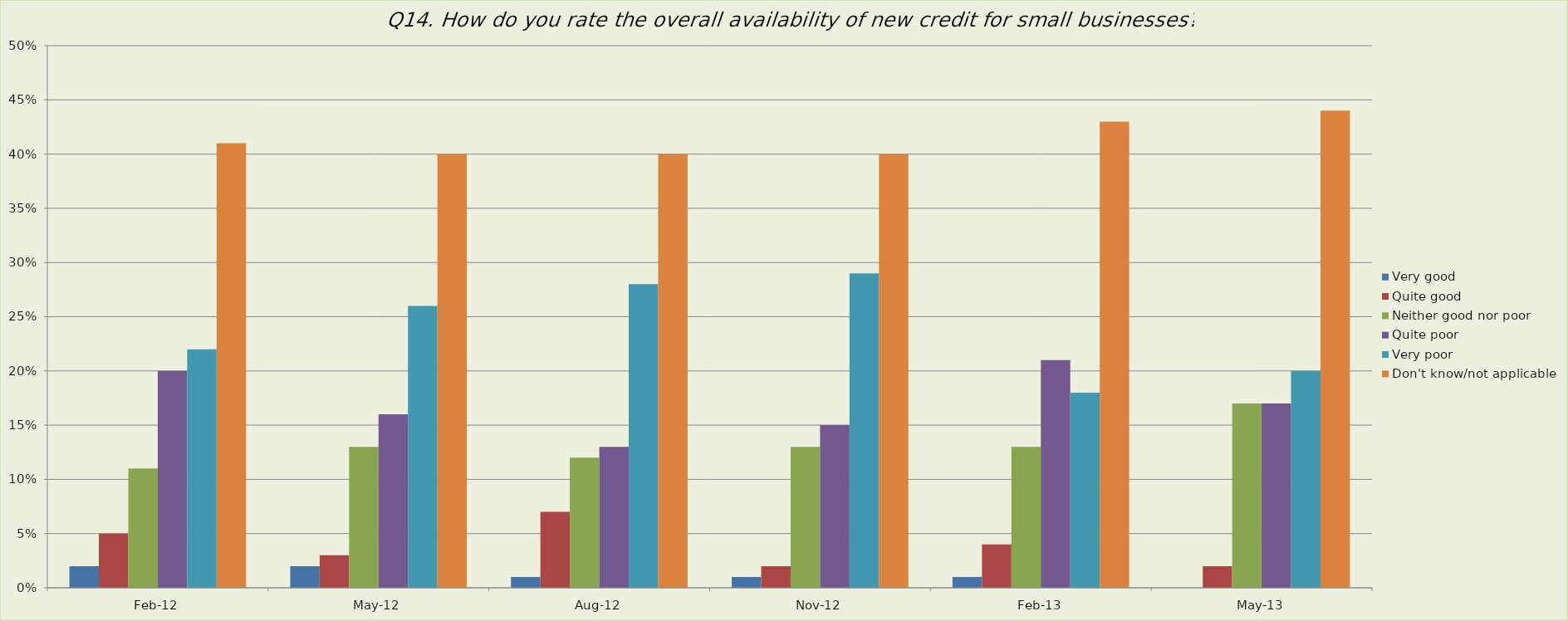
| Category | Very good | Quite good | Neither good nor poor | Quite poor | Very poor | Don't know/not applicable |
|---|---|---|---|---|---|---|
| 2012-02-01 | 0.02 | 0.05 | 0.11 | 0.2 | 0.22 | 0.41 |
| 2012-05-01 | 0.02 | 0.03 | 0.13 | 0.16 | 0.26 | 0.4 |
| 2012-08-01 | 0.01 | 0.07 | 0.12 | 0.13 | 0.28 | 0.4 |
| 2012-11-01 | 0.01 | 0.02 | 0.13 | 0.15 | 0.29 | 0.4 |
| 2013-02-01 | 0.01 | 0.04 | 0.13 | 0.21 | 0.18 | 0.43 |
| 2013-05-01 | 0 | 0.02 | 0.17 | 0.17 | 0.2 | 0.44 |